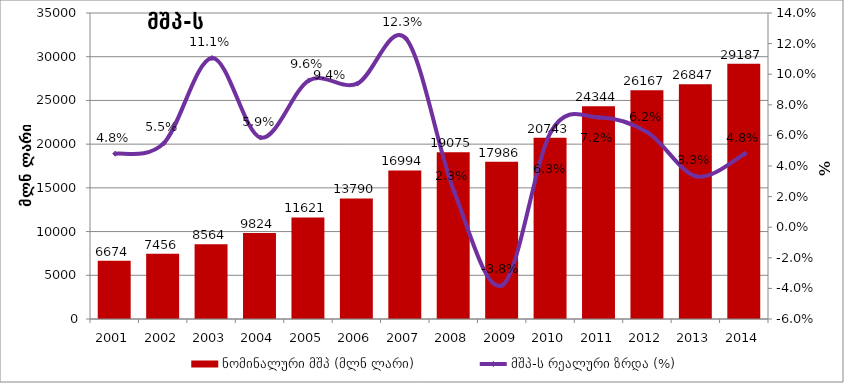
| Category | ნომინალური მშპ (მლნ ლარი) |
|---|---|
| 2001.0 | 6673.998 |
| 2002.0 | 7456.026 |
| 2003.0 | 8564.093 |
| 2004.0 | 9824.295 |
| 2005.0 | 11620.942 |
| 2006.0 | 13789.913 |
| 2007.0 | 16993.779 |
| 2008.0 | 19074.852 |
| 2009.0 | 17985.955 |
| 2010.0 | 20743.364 |
| 2011.0 | 24343.987 |
| 2012.0 | 26167.284 |
| 2013.0 | 26847.354 |
| 2014.0 | 29187 |